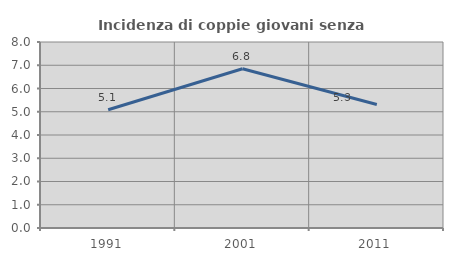
| Category | Incidenza di coppie giovani senza figli |
|---|---|
| 1991.0 | 5.088 |
| 2001.0 | 6.848 |
| 2011.0 | 5.312 |